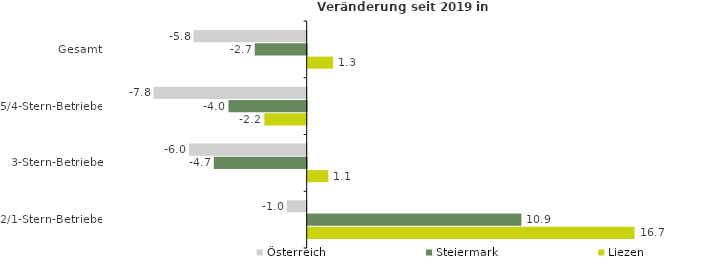
| Category | Österreich | Steiermark | Liezen |
|---|---|---|---|
| Gesamt | -5.779 | -2.653 | 1.3 |
| 5/4-Stern-Betriebe | -7.825 | -3.996 | -2.161 |
| 3-Stern-Betriebe | -6.014 | -4.748 | 1.055 |
| 2/1-Stern-Betriebe | -1.021 | 10.926 | 16.706 |